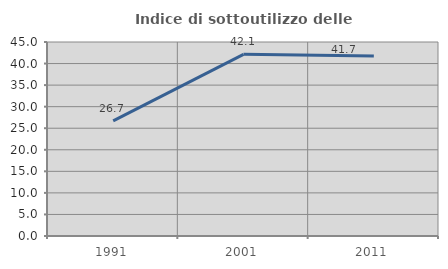
| Category | Indice di sottoutilizzo delle abitazioni  |
|---|---|
| 1991.0 | 26.703 |
| 2001.0 | 42.133 |
| 2011.0 | 41.724 |